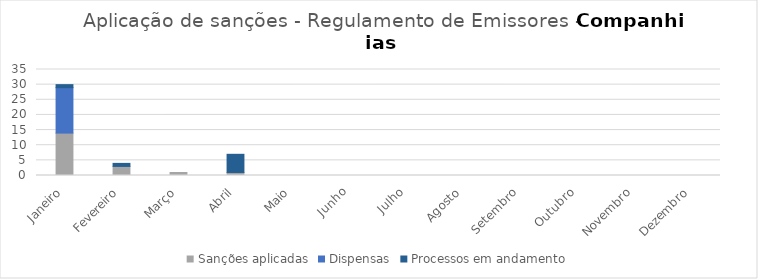
| Category | Sanções aplicadas | Dispensas | Processos em andamento |
|---|---|---|---|
| Janeiro | 14 | 15 | 1 |
| Fevereiro | 3 | 0 | 1 |
| Março | 1 | 0 | 0 |
| Abril | 1 | 0 | 6 |
| Maio | 0 | 0 | 0 |
| Junho | 0 | 0 | 0 |
| Julho | 0 | 0 | 0 |
| Agosto | 0 | 0 | 0 |
| Setembro | 0 | 0 | 0 |
| Outubro | 0 | 0 | 0 |
| Novembro | 0 | 0 | 0 |
| Dezembro | 0 | 0 | 0 |